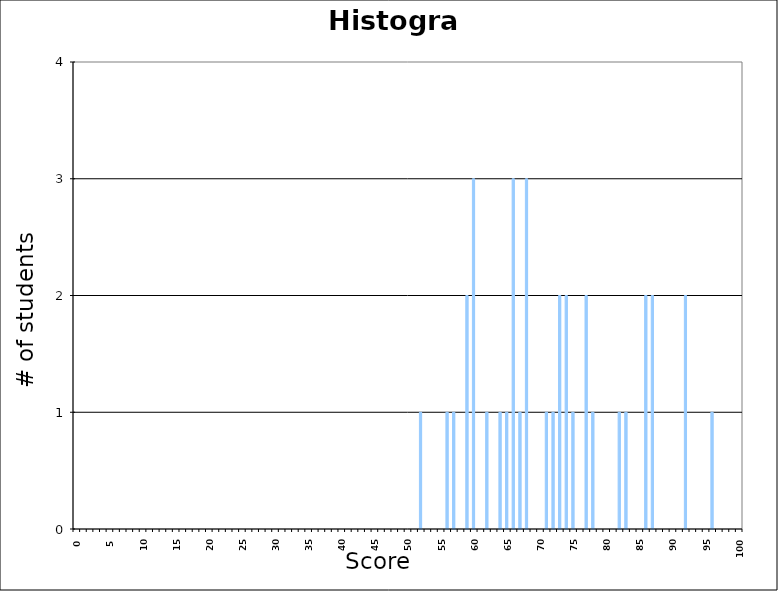
| Category | Series 1 |
|---|---|
| 0.0 | 0 |
| 1.0 | 0 |
| 2.0 | 0 |
| 3.0 | 0 |
| 4.0 | 0 |
| 5.0 | 0 |
| 6.0 | 0 |
| 7.0 | 0 |
| 8.0 | 0 |
| 9.0 | 0 |
| 10.0 | 0 |
| 11.0 | 0 |
| 12.0 | 0 |
| 13.0 | 0 |
| 14.0 | 0 |
| 15.0 | 0 |
| 16.0 | 0 |
| 17.0 | 0 |
| 18.0 | 0 |
| 19.0 | 0 |
| 20.0 | 0 |
| 21.0 | 0 |
| 22.0 | 0 |
| 23.0 | 0 |
| 24.0 | 0 |
| 25.0 | 0 |
| 26.0 | 0 |
| 27.0 | 0 |
| 28.0 | 0 |
| 29.0 | 0 |
| 30.0 | 0 |
| 31.0 | 0 |
| 32.0 | 0 |
| 33.0 | 0 |
| 34.0 | 0 |
| 35.0 | 0 |
| 36.0 | 0 |
| 37.0 | 0 |
| 38.0 | 0 |
| 39.0 | 0 |
| 40.0 | 0 |
| 41.0 | 0 |
| 42.0 | 0 |
| 43.0 | 0 |
| 44.0 | 0 |
| 45.0 | 0 |
| 46.0 | 0 |
| 47.0 | 0 |
| 48.0 | 0 |
| 49.0 | 0 |
| 50.0 | 0 |
| 51.0 | 0 |
| 52.0 | 1 |
| 53.0 | 0 |
| 54.0 | 0 |
| 55.0 | 0 |
| 56.0 | 1 |
| 57.0 | 1 |
| 58.0 | 0 |
| 59.0 | 2 |
| 60.0 | 3 |
| 61.0 | 0 |
| 62.0 | 1 |
| 63.0 | 0 |
| 64.0 | 1 |
| 65.0 | 1 |
| 66.0 | 3 |
| 67.0 | 1 |
| 68.0 | 3 |
| 69.0 | 0 |
| 70.0 | 0 |
| 71.0 | 1 |
| 72.0 | 1 |
| 73.0 | 2 |
| 74.0 | 2 |
| 75.0 | 1 |
| 76.0 | 0 |
| 77.0 | 2 |
| 78.0 | 1 |
| 79.0 | 0 |
| 80.0 | 0 |
| 81.0 | 0 |
| 82.0 | 1 |
| 83.0 | 1 |
| 84.0 | 0 |
| 85.0 | 0 |
| 86.0 | 2 |
| 87.0 | 2 |
| 88.0 | 0 |
| 89.0 | 0 |
| 90.0 | 0 |
| 91.0 | 0 |
| 92.0 | 2 |
| 93.0 | 0 |
| 94.0 | 0 |
| 95.0 | 0 |
| 96.0 | 1 |
| 97.0 | 0 |
| 98.0 | 0 |
| 99.0 | 0 |
| 100.0 | 0 |